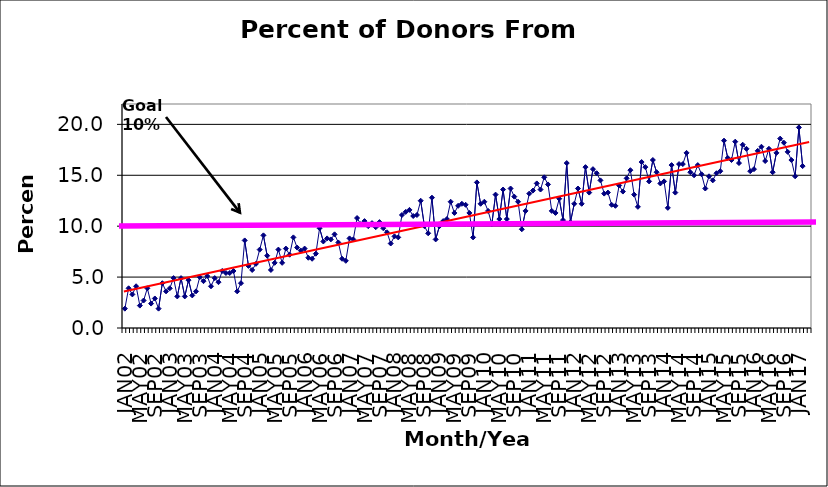
| Category | Series 0 |
|---|---|
| JAN02 | 1.9 |
| FEB02 | 3.9 |
| MAR02 | 3.3 |
| APR02 | 4.1 |
| MAY02 | 2.2 |
| JUN02 | 2.7 |
| JUL02 | 3.9 |
| AUG02 | 2.4 |
| SEP02 | 2.9 |
| OCT02 | 1.9 |
| NOV02 | 4.4 |
| DEC02 | 3.6 |
| JAN03 | 3.9 |
| FEB03 | 4.9 |
| MAR03 | 3.1 |
| APR03 | 4.9 |
| MAY03 | 3.1 |
| JUN03 | 4.7 |
| JUL03 | 3.2 |
| AUG03 | 3.6 |
| SEP03 | 5 |
| OCT03 | 4.6 |
| NOV03 | 5.1 |
| DEC03 | 4.1 |
| JAN04 | 4.9 |
| FEB04 | 4.5 |
| MAR04 | 5.6 |
| APR04 | 5.4 |
| MAY04 | 5.4 |
| JUN04 | 5.6 |
| JUL04 | 3.6 |
| AUG04 | 4.4 |
| SEP04 | 8.6 |
| OCT04 | 6.1 |
| NOV04 | 5.7 |
| DEC04 | 6.3 |
| JAN05 | 7.7 |
| FEB05 | 9.1 |
| MAR05 | 7.1 |
| APR05 | 5.7 |
| MAY05 | 6.4 |
| JUN05 | 7.7 |
| JUL05 | 6.4 |
| AUG05 | 7.8 |
| SEP05 | 7.2 |
| OCT05 | 8.9 |
| NOV05 | 7.9 |
| DEC05 | 7.6 |
| JAN06 | 7.8 |
| FEB06 | 6.9 |
| MAR06 | 6.8 |
| APR06 | 7.3 |
| MAY06 | 9.8 |
| JUN06 | 8.5 |
| JUL06 | 8.8 |
| AUG06 | 8.7 |
| SEP06 | 9.2 |
| OCT06 | 8.4 |
| NOV06 | 6.8 |
| DEC06 | 6.6 |
| JAN07 | 8.8 |
| FEB07 | 8.7 |
| MAR07 | 10.8 |
| APR07 | 10.2 |
| MAY07 | 10.5 |
| JUN07 | 10 |
| JUL07 | 10.3 |
| AUG07 | 9.9 |
| SEP07 | 10.4 |
| OCT07 | 9.8 |
| NOV07 | 9.4 |
| DEC07 | 8.3 |
| JAN08 | 9 |
| FEB08 | 8.9 |
| MAR08 | 11.1 |
| APR08 | 11.4 |
| MAY08 | 11.6 |
| JUN08 | 11 |
| JUL08 | 11.1 |
| AUG08 | 12.5 |
| SEP08 | 10 |
| OCT08 | 9.3 |
| NOV08 | 12.8 |
| DEC08 | 8.7 |
| JAN09 | 10 |
| FEB09 | 10.5 |
| MAR09 | 10.7 |
| APR09 | 12.4 |
| MAY09 | 11.3 |
| JUN09 | 12 |
| JUL09 | 12.2 |
| AUG09 | 12.1 |
| SEP09 | 11.3 |
| OCT09 | 8.9 |
| NOV09 | 14.3 |
| DEC09 | 12.2 |
| JAN10 | 12.4 |
| FEB10 | 11.5 |
| MAR10 | 10.2 |
| APR10 | 13.1 |
| MAY10 | 10.7 |
| JUN10 | 13.6 |
| JUL10 | 10.7 |
| AUG10 | 13.7 |
| SEP10 | 12.9 |
| OCT10 | 12.4 |
| NOV10 | 9.7 |
| DEC10 | 11.5 |
| JAN11 | 13.2 |
| FEB11 | 13.5 |
| MAR11 | 14.2 |
| APR11 | 13.6 |
| MAY11 | 14.8 |
| JUN11 | 14.1 |
| JUL11 | 11.5 |
| AUG11 | 11.3 |
| SEP11 | 12.7 |
| OCT11 | 10.6 |
| NOV11 | 16.2 |
| DEC11 | 10.4 |
| JAN12 | 12.2 |
| FEB12 | 13.7 |
| MAR12 | 12.2 |
| APR12 | 15.8 |
| MAY12 | 13.3 |
| JUN12 | 15.6 |
| JUL12 | 15.2 |
| AUG12 | 14.5 |
| SEP12 | 13.2 |
| OCT12 | 13.3 |
| NOV12 | 12.1 |
| DEC12 | 12 |
| JAN13 | 14 |
| FEB13 | 13.4 |
| MAR13 | 14.7 |
| APR13 | 15.5 |
| MAY13 | 13.1 |
| JUN13 | 11.9 |
| JUL13 | 16.3 |
| AUG13 | 15.8 |
| SEP13 | 14.4 |
| OCT13 | 16.5 |
| NOV13 | 15.3 |
| DEC13 | 14.2 |
| JAN14 | 14.4 |
| FEB14 | 11.8 |
| MAR14 | 16 |
| APR14 | 13.3 |
| MAY14 | 16.1 |
| JUN14 | 16.1 |
| JUL14 | 17.2 |
| AUG14 | 15.3 |
| SEP14 | 15 |
| OCT14 | 16 |
| NOV14 | 15.1 |
| DEC14 | 13.7 |
| JAN15 | 14.9 |
| FEB15 | 14.5 |
| MAR15 | 15.2 |
| APR15 | 15.4 |
| MAY15 | 18.4 |
| JUN15 | 16.7 |
| JUL15 | 16.5 |
| AUG15 | 18.3 |
| SEP15 | 16.2 |
| OCT15 | 18 |
| NOV15 | 17.6 |
| DEC15 | 15.4 |
| JAN16 | 15.6 |
| FEB16 | 17.4 |
| MAR16 | 17.8 |
| APR16 | 16.4 |
| MAY16 | 17.6 |
| JUN16 | 15.3 |
| JUL16 | 17.2 |
| AUG16 | 18.6 |
| SEP16 | 18.2 |
| OCT16 | 17.3 |
| NOV16 | 16.5 |
| DEC16 | 14.9 |
| JAN17 | 19.7 |
| FEB17 | 15.9 |